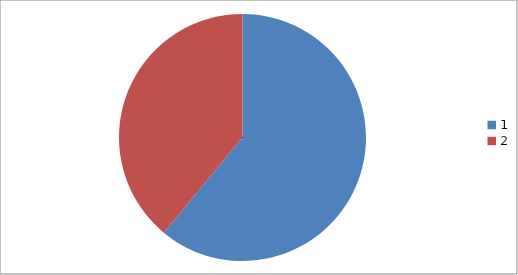
| Category | Series 0 |
|---|---|
| 0 | 0.61 |
| 1 | 0.39 |